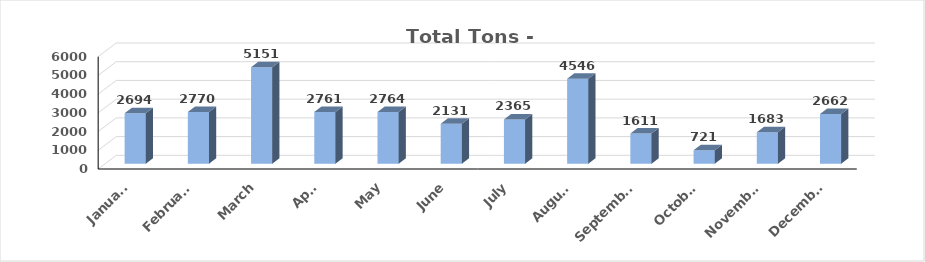
| Category | TONS |
|---|---|
| January | 2694 |
| February | 2770 |
| March | 5151 |
| April | 2761 |
| May | 2764 |
| June | 2131 |
| July | 2365 |
| August | 4546 |
| September | 1611 |
| October | 721 |
| November | 1683 |
| December | 2662 |